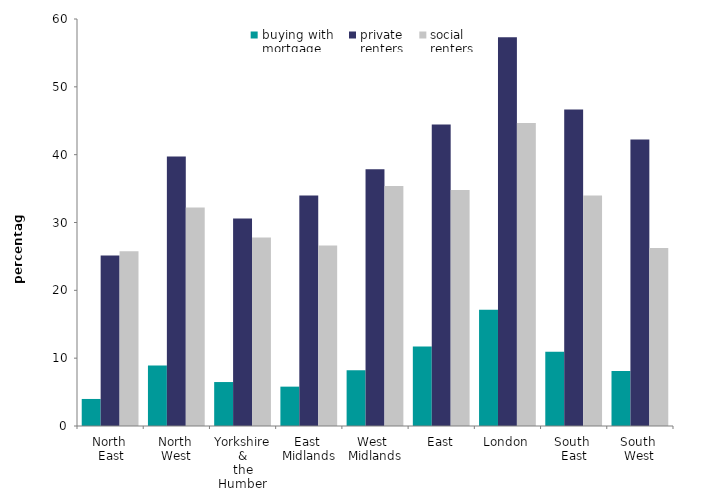
| Category | buying with
mortgage | private
renters  | social
renters |
|---|---|---|---|
| North 
East | 3.986 | 25.127 | 25.755 |
| North 
West | 8.915 | 39.725 | 32.228 |
| Yorkshire &
the Humber | 6.481 | 30.592 | 27.782 |
| East 
Midlands | 5.802 | 33.995 | 26.621 |
| West 
Midlands | 8.234 | 37.855 | 35.396 |
| East | 11.727 | 44.465 | 34.781 |
| London | 17.144 | 57.304 | 44.687 |
| South 
East | 10.95 | 46.644 | 33.974 |
| South 
West | 8.114 | 42.228 | 26.235 |